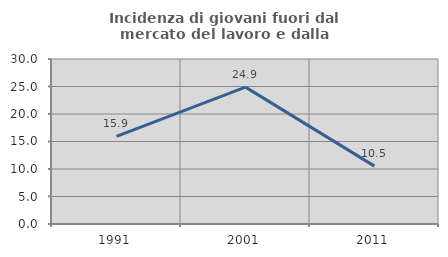
| Category | Incidenza di giovani fuori dal mercato del lavoro e dalla formazione  |
|---|---|
| 1991.0 | 15.937 |
| 2001.0 | 24.888 |
| 2011.0 | 10.526 |